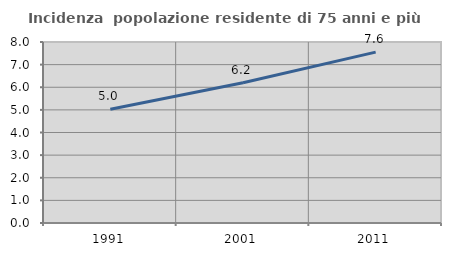
| Category | Incidenza  popolazione residente di 75 anni e più |
|---|---|
| 1991.0 | 5.027 |
| 2001.0 | 6.197 |
| 2011.0 | 7.554 |